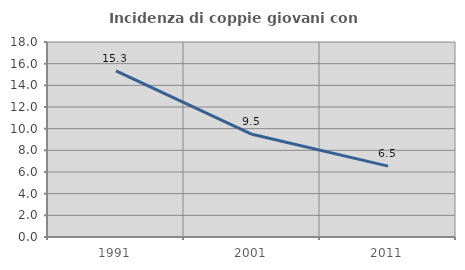
| Category | Incidenza di coppie giovani con figli |
|---|---|
| 1991.0 | 15.339 |
| 2001.0 | 9.477 |
| 2011.0 | 6.545 |